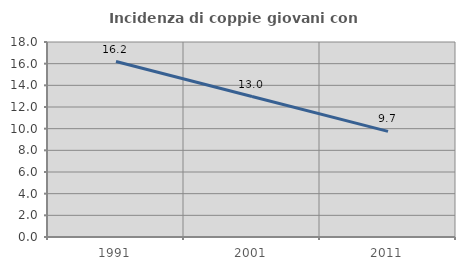
| Category | Incidenza di coppie giovani con figli |
|---|---|
| 1991.0 | 16.194 |
| 2001.0 | 12.963 |
| 2011.0 | 9.748 |